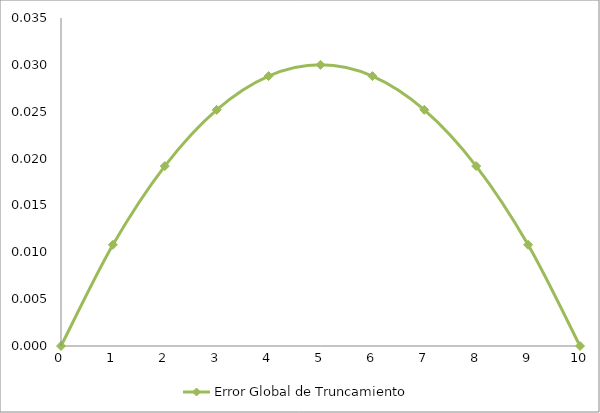
| Category | Error Global de Truncamiento |
|---|---|
| 0.0 | 0 |
| 1.0 | 0.011 |
| 2.0 | 0.019 |
| 3.0 | 0.025 |
| 4.0 | 0.029 |
| 5.0 | 0.03 |
| 6.0 | 0.029 |
| 7.0 | 0.025 |
| 8.0 | 0.019 |
| 9.0 | 0.011 |
| 10.0 | 0 |